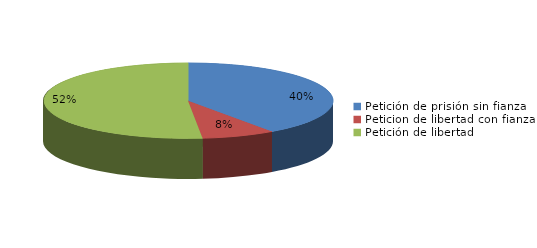
| Category | Series 0 |
|---|---|
| Petición de prisión sin fianza | 88 |
| Peticion de libertad con fianza | 18 |
| Petición de libertad | 113 |